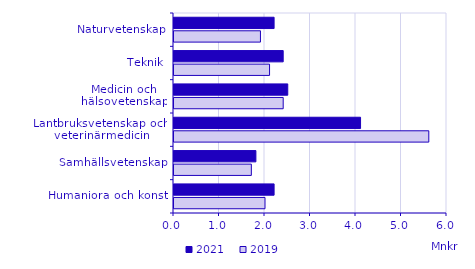
| Category | 2021 | 2019 |
|---|---|---|
| Naturvetenskap | 2.2 | 1.9 |
| Teknik | 2.4 | 2.1 |
| Medicin och hälsovetenskap | 2.5 | 2.4 |
| Lantbruksvetenskap och veterinärmedicin | 4.1 | 5.6 |
| Samhällsvetenskap | 1.8 | 1.7 |
| Humaniora och konst | 2.2 | 2 |